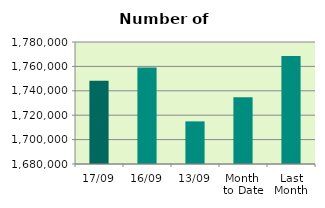
| Category | Series 0 |
|---|---|
| 17/09 | 1748228 |
| 16/09 | 1759146 |
| 13/09 | 1714938 |
| Month 
to Date | 1734743.5 |
| Last
Month | 1768562.909 |